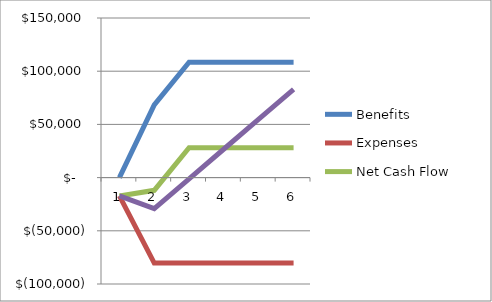
| Category | Benefits | Expenses | Net Cash Flow | Cumulative Cash Flow |
|---|---|---|---|---|
| 0 | 0 | -17248 | -17248 | -17248 |
| 1 | 68400 | -80358.4 | -11958.4 | -29206.4 |
| 2 | 108400 | -80358.4 | 28041.6 | -1164.8 |
| 3 | 108400 | -80358.4 | 28041.6 | 26876.8 |
| 4 | 108400 | -80358.4 | 28041.6 | 54918.4 |
| 5 | 108400 | -80358.4 | 28041.6 | 82960 |